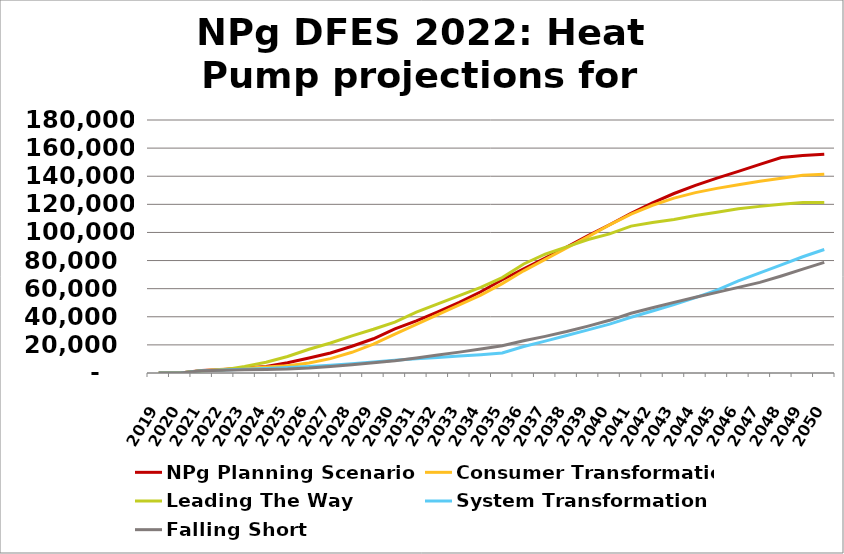
| Category | NPg Planning Scenario | Consumer Transformation | Leading The Way | System Transformation | Falling Short |
|---|---|---|---|---|---|
| 2019.0 | 0 | 0 | 0 | 0 | 0 |
| 2020.0 | 0 | 0 | 0 | 0 | 0 |
| 2021.0 | 1695 | 1546 | 1546 | 1546 | 1546 |
| 2022.0 | 2551 | 2609 | 2186 | 2154 | 1916 |
| 2023.0 | 3554 | 3385 | 4713 | 2666 | 2241 |
| 2024.0 | 4616 | 4251 | 7657 | 3220 | 2569 |
| 2025.0 | 7314 | 5111 | 11742 | 3827 | 2899 |
| 2026.0 | 10699 | 7130 | 16861 | 4577 | 3574 |
| 2027.0 | 14262 | 10206 | 21340 | 5597 | 4610 |
| 2028.0 | 19057 | 14719 | 26407 | 6663 | 5854 |
| 2029.0 | 24355 | 20483 | 31098 | 7804 | 7240 |
| 2030.0 | 31393 | 27581 | 36189 | 9001 | 8763 |
| 2031.0 | 37078 | 34648 | 43256 | 10214 | 10745 |
| 2032.0 | 43475 | 41604 | 49139 | 11114 | 12743 |
| 2033.0 | 50218 | 48530 | 55077 | 12035 | 14845 |
| 2034.0 | 57821 | 55408 | 60969 | 12977 | 17093 |
| 2035.0 | 66329 | 63577 | 67905 | 14213 | 19374 |
| 2036.0 | 74043 | 72695 | 77544 | 18847 | 22957 |
| 2037.0 | 81790 | 80849 | 84486 | 22683 | 26063 |
| 2038.0 | 89652 | 88958 | 89721 | 26626 | 29506 |
| 2039.0 | 97756 | 97017 | 94945 | 30658 | 33320 |
| 2040.0 | 105465 | 105339 | 98938 | 34766 | 37485 |
| 2041.0 | 113598 | 112965 | 104522 | 39697 | 42530 |
| 2042.0 | 121056 | 119334 | 107100 | 44077 | 46441 |
| 2043.0 | 127700 | 124431 | 109256 | 48678 | 50224 |
| 2044.0 | 133472 | 128332 | 112089 | 53615 | 53844 |
| 2045.0 | 138690 | 131347 | 114433 | 59000 | 57350 |
| 2046.0 | 143484 | 133940 | 116851 | 65564 | 60933 |
| 2047.0 | 148393 | 136350 | 118548 | 71286 | 64496 |
| 2048.0 | 153291 | 138604 | 119994 | 76987 | 69054 |
| 2049.0 | 154744 | 140607 | 121284 | 82688 | 73884 |
| 2050.0 | 155642 | 141463 | 121356 | 87845 | 78672 |